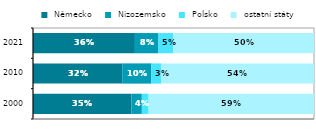
| Category |  Německo |  Nizozemsko |  Polsko |  ostatní státy |
|---|---|---|---|---|
| 2000 | 0.35 | 0.037 | 0.024 | 0.589 |
|  2010 | 0.318 | 0.103 | 0.035 | 0.545 |
| 2021 | 0.363 | 0.084 | 0.053 | 0.501 |